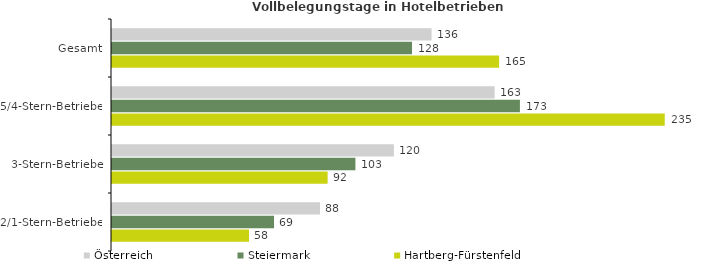
| Category | Österreich | Steiermark | Hartberg-Fürstenfeld |
|---|---|---|---|
| Gesamt | 135.866 | 127.561 | 164.59 |
| 5/4-Stern-Betriebe | 162.683 | 173.435 | 235.015 |
| 3-Stern-Betriebe | 119.851 | 103.499 | 91.678 |
| 2/1-Stern-Betriebe | 88.435 | 68.894 | 58.251 |